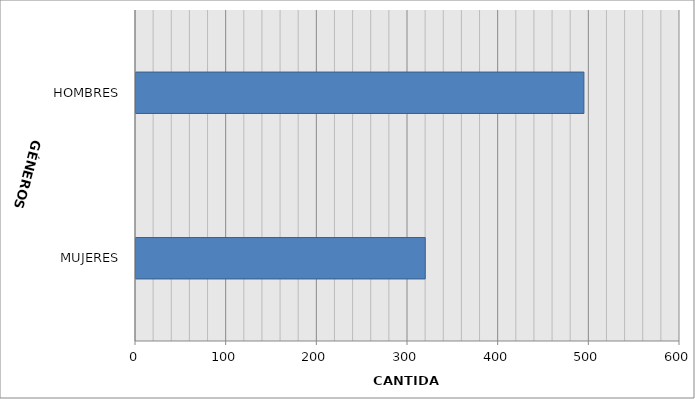
| Category | Series 0 |
|---|---|
| MUJERES | 319 |
| HOMBRES | 494 |